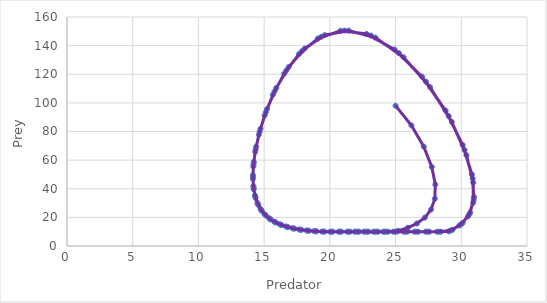
| Category | Prey |
|---|---|
| 25.0 | 98 |
| 26.205 | 84.28 |
| 27.14450166 | 69.434 |
| 27.75499969457841 | 55.246 |
| 28.02482369858515 | 42.946 |
| 27.98702141169555 | 33.036 |
| 27.69966674099162 | 25.451 |
| 27.22615918110089 | 19.826 |
| 26.62292923933483 | 15.727 |
| 25.93483098410763 | 12.759 |
| 25.19525389374172 | 10.615 |
| 24.42814780791589 | 10 |
| 23.6708752258705 | 10 |
| 22.93707809386851 | 10 |
| 22.22602867295859 | 10 |
| 21.53702178409687 | 10 |
| 20.86937410878987 | 10 |
| 20.22242351141739 | 10 |
| 19.59552838256345 | 10.033 |
| 18.98865380357606 | 10.255 |
| 18.4043694285224 | 10.669 |
| 17.84491616989623 | 11.286 |
| 17.31238490116938 | 12.129 |
| 16.80887362286055 | 13.228 |
| 16.33663561361337 | 14.627 |
| 15.89822959223697 | 16.381 |
| 15.49668236998661 | 18.56 |
| 15.1356747608334 | 21.253 |
| 14.8197625311007 | 24.567 |
| 14.55464575051938 | 28.631 |
| 14.34750172181076 | 33.594 |
| 14.20739794268414 | 39.627 |
| 14.14580054191532 | 46.91 |
| 14.17718654320503 | 55.617 |
| 14.31974733408307 | 65.889 |
| 14.59612053326112 | 77.776 |
| 15.03397992833005 | 91.162 |
| 15.6661016831568 | 105.656 |
| 16.52914654240241 | 120.449 |
| 17.65980896127934 | 134.195 |
| 19.08629508523574 | 144.959 |
| 20.81289417073035 | 150.382 |
| 22.79726896873048 | 148.218 |
| 24.92645105013754 | 137.262 |
| 27.00870617789556 | 118.348 |
| 28.80514996166039 | 94.648 |
| 30.10665265825566 | 70.593 |
| 30.81516296587012 | 49.895 |
| 30.96632355670834 | 34.205 |
| 30.68095882079529 | 23.294 |
| 30.09693696844461 | 16.063 |
| 29.32816009249947 | 11.358 |
| 28.45483122626163 | 10 |
| 27.57273145824752 | 10 |
| 26.71797678304184 | 10 |
| 25.88971950276755 | 10 |
| 25.08713819818175 | 10 |
| 24.30943691403812 | 10 |
| 23.55584436970294 | 10 |
| 22.82561319424215 | 10 |
| 22.11801918522064 | 10 |
| 21.4323605904788 | 10 |
| 20.76795741217396 | 10 |
| 20.12415073239657 | 10 |
| 19.50030205969227 | 10.063 |
| 18.89689405929587 | 10.314 |
| 18.31643455926823 | 10.759 |
| 17.76113218995291 | 11.41 |
| 17.23307088749932 | 12.29 |
| 16.73436494193 | 13.433 |
| 16.26730681063768 | 14.884 |
| 15.83451857845578 | 16.699 |
| 15.43911753508634 | 18.953 |
| 15.08490674781331 | 21.736 |
| 14.77660261915205 | 25.158 |
| 14.52011306020757 | 29.352 |
| 14.32288170096954 | 34.471 |
| 14.19431461651459 | 40.686 |
| 14.1463043896846 | 48.179 |
| 14.19385770004313 | 57.122 |
| 14.35580831418227 | 67.643 |
| 14.65554043122236 | 79.773 |
| 15.12152714416059 | 93.361 |
| 15.78725565275203 | 107.959 |
| 16.68970114216664 | 122.682 |
| 17.86489335007629 | 136.093 |
| 19.33845190323279 | 146.171 |
| 21.1089601266917 | 150.534 |
| 23.12444753464672 | 147.031 |
| 25.25947511396306 | 134.719 |
| 27.31174353797674 | 114.81 |
| 29.04136901023817 | 90.774 |
| 30.2523022535373 | 67.06 |
| 30.86806572735955 | 47.105 |
| 30.94198563523008 | 32.218 |
| 30.6015061753358 | 21.964 |
| 29.98237286199539 | 15.198 |
| 29.19319124890671 | 10.799 |
| 28.30919089645975 | 10 |
| 27.4316059786695 | 10 |
| 26.58122619333074 | 10 |
| 25.75720818133749 | 10 |
| 24.95873472771603 | 10 |
| 24.18501395115683 | 10 |
| 23.43527851867097 | 10 |
| 22.70878488459217 | 10 |
| 22.00481255316981 | 10 |
| 21.32266336402154 | 10 |
| 20.66166079973688 | 10 |
| 20.02114931494503 | 10 |
| 19.40049368618174 | 10.094 |
| 18.80071364341107 | 10.376 |
| 18.22425584879142 | 10.853 |
| 17.67329808704925 | 11.54 |
| 17.14991969328188 | 12.461 |
| 16.65625465278464 | 13.651 |
| 16.19463930618896 | 15.157 |
| 15.76776541344726 | 17.039 |
| 15.37884906036301 | 19.372 |
| 15.03182642119714 | 22.252 |
| 14.73158860297061 | 25.791 |
| 14.48426949513254 | 30.125 |
| 14.29760229570265 | 35.411 |
| 14.18136117106134 | 41.823 |
| 14.14790207579538 | 49.542 |
| 14.21280630949402 | 58.735 |
| 14.39560217033741 | 69.519 |
| 14.72047533025678 | 81.903 |
| 15.21674381839911 | 95.694 |
| 15.91861594665476 | 110.383 |
| 16.86330580386945 | 125.003 |
| 18.08593550933266 | 138.016 |
| 19.60902383349211 | 147.321 |
| 21.42459805275327 | 150.522 |
| 23.46999945343255 | 145.594 |
| 25.6065853717251 | 131.894 |
| 27.62193623404639 | 111.029 |
| 29.27719874317724 | 86.751 |
| 30.39196026867746 | 63.474 |
| 30.91248445285496 | 44.32 |
| 30.90903614665146 | 30.254 |
| 30.51429287037508 | 20.655 |
| 29.86097996286988 | 14.347 |
| 29.0521068031635 | 10.246 |
| 28.15792352079168 | 10 |
| 27.28502789164714 | 10 |
| 26.43919202700608 | 10 |
| 25.61957707416889 | 10 |
| 24.82537018486966 | 10 |
| 24.05578370913869 | 10 |
| 23.3100544141554 | 10 |
| 22.58744272731658 | 10 |
| 21.88723200276976 | 10 |